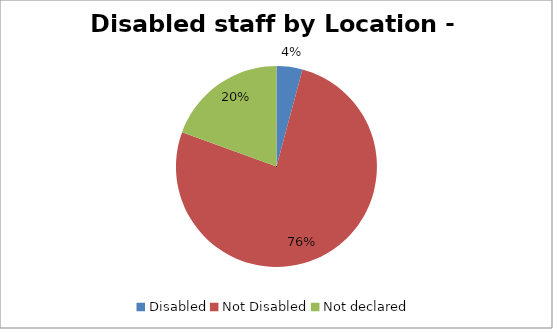
| Category | Other |
|---|---|
| Disabled | 0.042 |
| Not Disabled | 0.764 |
| Not declared | 0.194 |